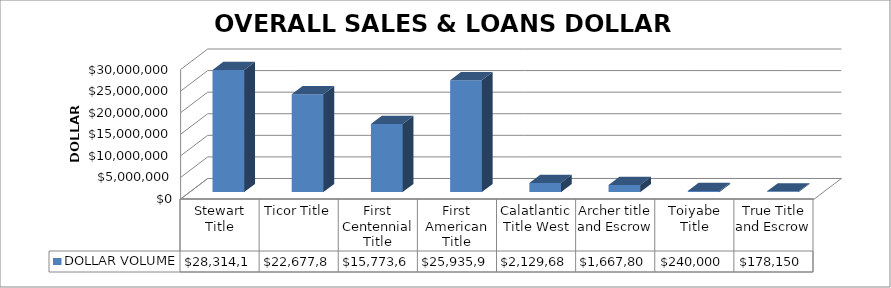
| Category | DOLLAR VOLUME |
|---|---|
| Stewart Title | 28314108 |
| Ticor Title | 22677800 |
| First Centennial Title | 15773603 |
| First American Title | 25935970 |
| Calatlantic Title West | 2129680 |
| Archer title and Escrow | 1667806 |
| Toiyabe Title | 240000 |
| True Title and Escrow | 178150 |